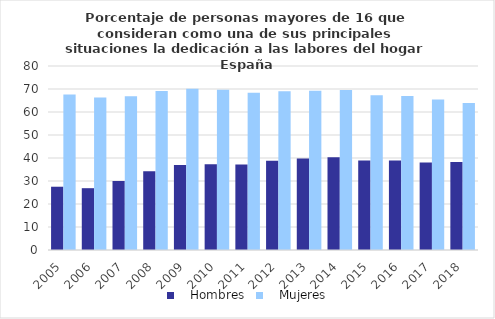
| Category |    Hombres |    Mujeres |
|---|---|---|
| 2005.0 | 27.512 | 67.57 |
| 2006.0 | 26.876 | 66.356 |
| 2007.0 | 30.052 | 66.795 |
| 2008.0 | 34.251 | 69.161 |
| 2009.0 | 36.959 | 70.138 |
| 2010.0 | 37.26 | 69.684 |
| 2011.0 | 37.168 | 68.397 |
| 2012.0 | 38.844 | 68.969 |
| 2013.0 | 39.782 | 69.259 |
| 2014.0 | 40.378 | 69.545 |
| 2015.0 | 38.884 | 67.328 |
| 2016.0 | 38.884 | 66.951 |
| 2017.0 | 38.001 | 65.457 |
| 2018.0 | 38.295 | 63.92 |